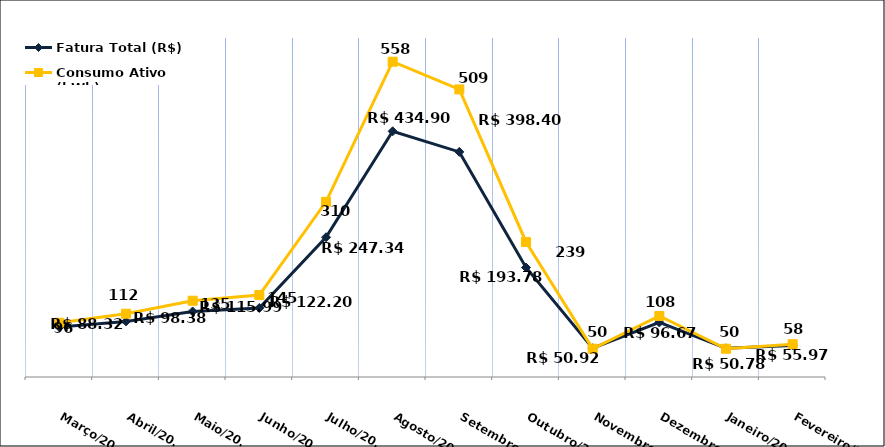
| Category | Fatura Total (R$) |
|---|---|
| Março/2023 | 88.32 |
| Abril/2023 | 98.38 |
| Maio/2023 | 115.99 |
| Junho/2023 | 122.2 |
| Julho/2023 | 247.34 |
| Agosto/2023 | 434.9 |
| Setembro/2023 | 398.4 |
| Outubro/2023 | 193.78 |
| Novembro/2023 | 50.92 |
| Dezembro/2023 | 96.67 |
| Janeiro/2024 | 50.78 |
| Fevereiro/2024 | 55.97 |